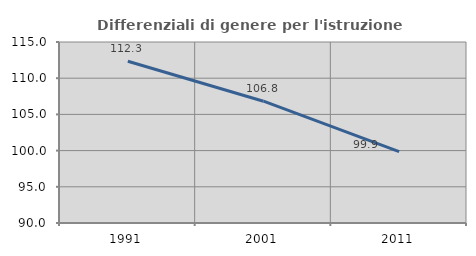
| Category | Differenziali di genere per l'istruzione superiore |
|---|---|
| 1991.0 | 112.347 |
| 2001.0 | 106.824 |
| 2011.0 | 99.86 |